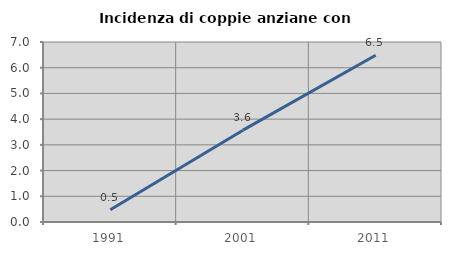
| Category | Incidenza di coppie anziane con figli |
|---|---|
| 1991.0 | 0.476 |
| 2001.0 | 3.571 |
| 2011.0 | 6.486 |